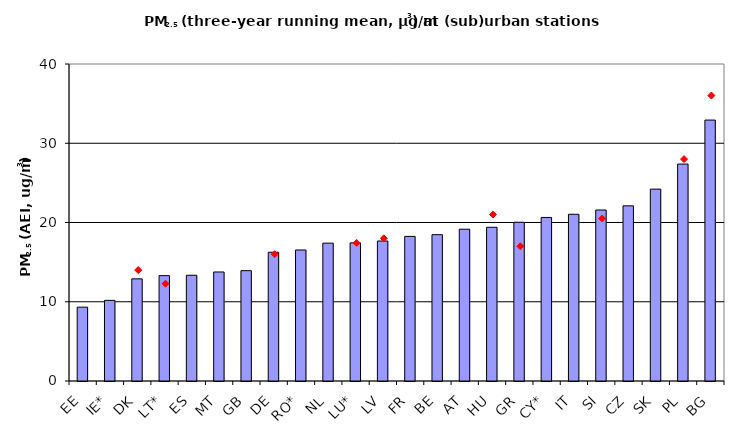
| Category | AEI |
|---|---|
| EE | 9.317 |
| IE* | 10.173 |
| DK | 12.889 |
| LT* | 13.296 |
| ES | 13.344 |
| MT | 13.756 |
| GB | 13.925 |
| DE | 16.245 |
| RO* | 16.534 |
| NL | 17.396 |
| LU* | 17.43 |
| LV | 17.664 |
| FR | 18.246 |
| BE | 18.464 |
| AT | 19.155 |
| HU | 19.397 |
| GR | 20.028 |
| CY* | 20.636 |
| IT | 21.038 |
| SI | 21.576 |
| CZ | 22.102 |
| SK | 24.212 |
| PL | 27.373 |
| BG | 32.925 |